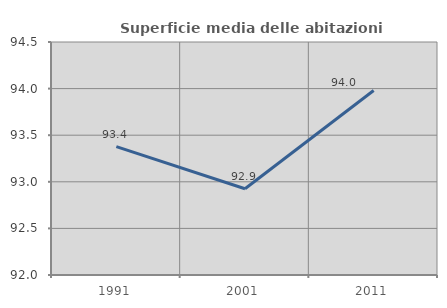
| Category | Superficie media delle abitazioni occupate |
|---|---|
| 1991.0 | 93.377 |
| 2001.0 | 92.925 |
| 2011.0 | 93.979 |